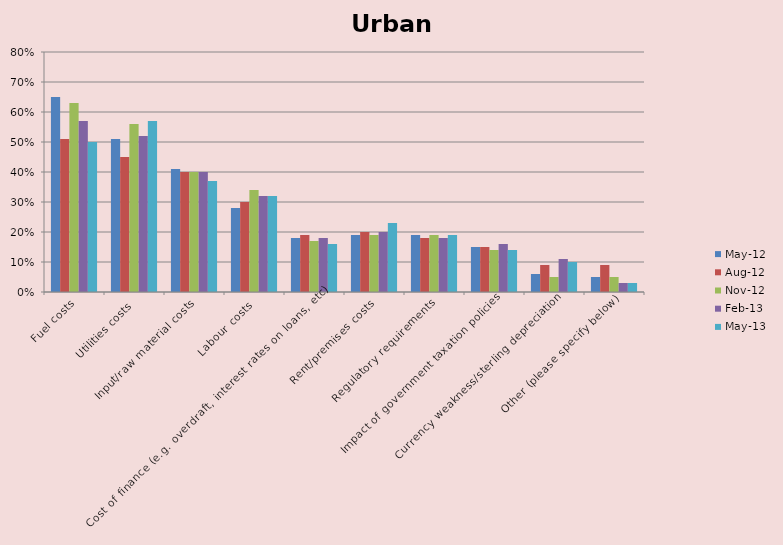
| Category | May-12 | Aug-12 | Nov-12 | Feb-13 | May-13 |
|---|---|---|---|---|---|
| Fuel costs | 0.65 | 0.51 | 0.63 | 0.57 | 0.5 |
| Utilities costs | 0.51 | 0.45 | 0.56 | 0.52 | 0.57 |
| Input/raw material costs | 0.41 | 0.4 | 0.4 | 0.4 | 0.37 |
| Labour costs | 0.28 | 0.3 | 0.34 | 0.32 | 0.32 |
| Cost of finance (e.g. overdraft, interest rates on loans, etc) | 0.18 | 0.19 | 0.17 | 0.18 | 0.16 |
| Rent/premises costs | 0.19 | 0.2 | 0.19 | 0.2 | 0.23 |
| Regulatory requirements | 0.19 | 0.18 | 0.19 | 0.18 | 0.19 |
| Impact of government taxation policies | 0.15 | 0.15 | 0.14 | 0.16 | 0.14 |
| Currency weakness/sterling depreciation | 0.06 | 0.09 | 0.05 | 0.11 | 0.1 |
| Other (please specify below) | 0.05 | 0.09 | 0.05 | 0.03 | 0.03 |